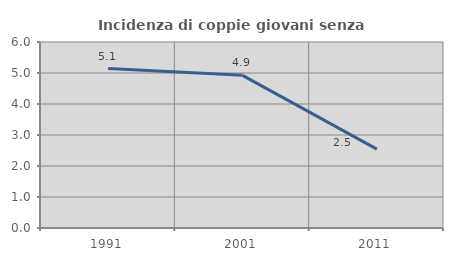
| Category | Incidenza di coppie giovani senza figli |
|---|---|
| 1991.0 | 5.144 |
| 2001.0 | 4.924 |
| 2011.0 | 2.545 |